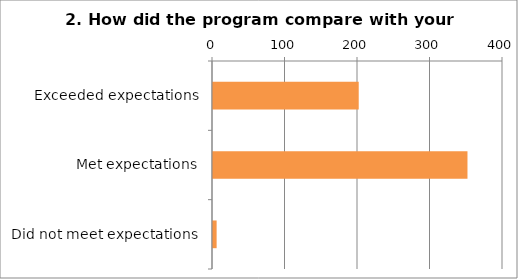
| Category | 2. How did the program compare with your expectations? |
|---|---|
| Exceeded expectations | 201 |
| Met expectations | 351 |
| Did not meet expectations | 5 |